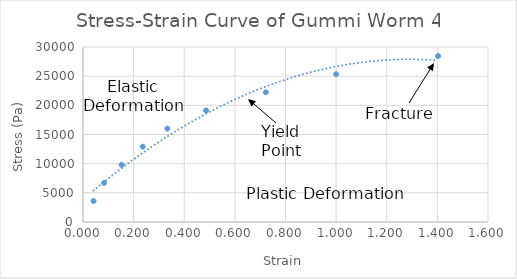
| Category | Series 0 |
|---|---|
| 0.041666666666666706 | 3584.138 |
| 0.08333333333333341 | 6692.674 |
| 0.15277777777777793 | 9801.211 |
| 0.23611111111111113 | 12909.747 |
| 0.3333333333333335 | 16018.283 |
| 0.4861111111111112 | 19126.819 |
| 0.7222222222222223 | 22235.355 |
| 1.0 | 25343.891 |
| 1.4027777777777777 | 28452.427 |